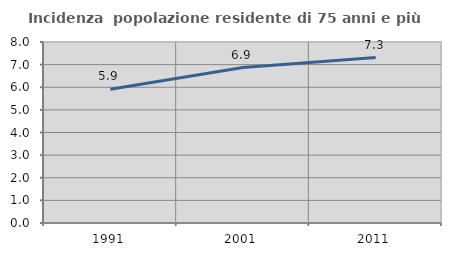
| Category | Incidenza  popolazione residente di 75 anni e più |
|---|---|
| 1991.0 | 5.911 |
| 2001.0 | 6.872 |
| 2011.0 | 7.311 |